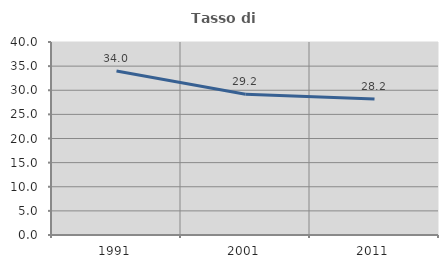
| Category | Tasso di occupazione   |
|---|---|
| 1991.0 | 33.977 |
| 2001.0 | 29.167 |
| 2011.0 | 28.212 |